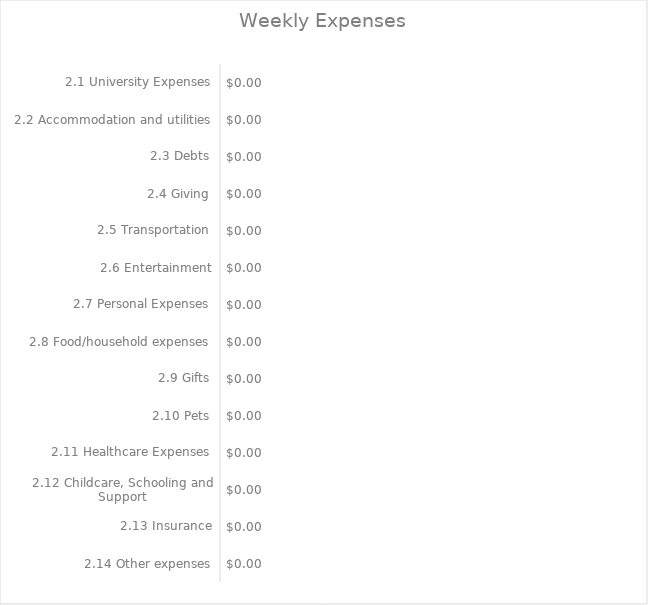
| Category | Series 0 |
|---|---|
| 2.1 University Expenses | 0 |
| 2.2 Accommodation and utilities | 0 |
| 2.3 Debts | 0 |
| 2.4 Giving | 0 |
| 2.5 Transportation | 0 |
| 2.6 Entertainment | 0 |
| 2.7 Personal Expenses | 0 |
| 2.8 Food/household expenses | 0 |
| 2.9 Gifts | 0 |
| 2.10 Pets | 0 |
| 2.11 Healthcare Expenses | 0 |
| 2.12 Childcare, Schooling and Support | 0 |
| 2.13 Insurance | 0 |
| 2.14 Other expenses | 0 |